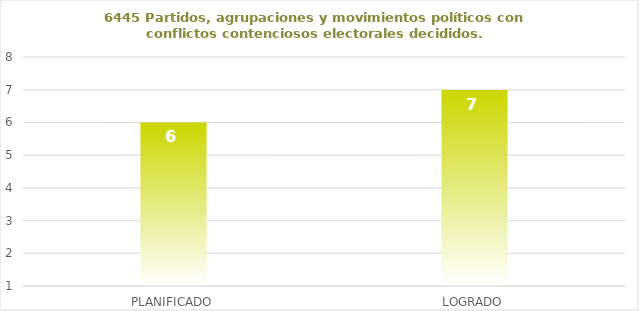
| Category | 6445 |
|---|---|
| PLANIFICADO | 6 |
| LOGRADO | 7 |